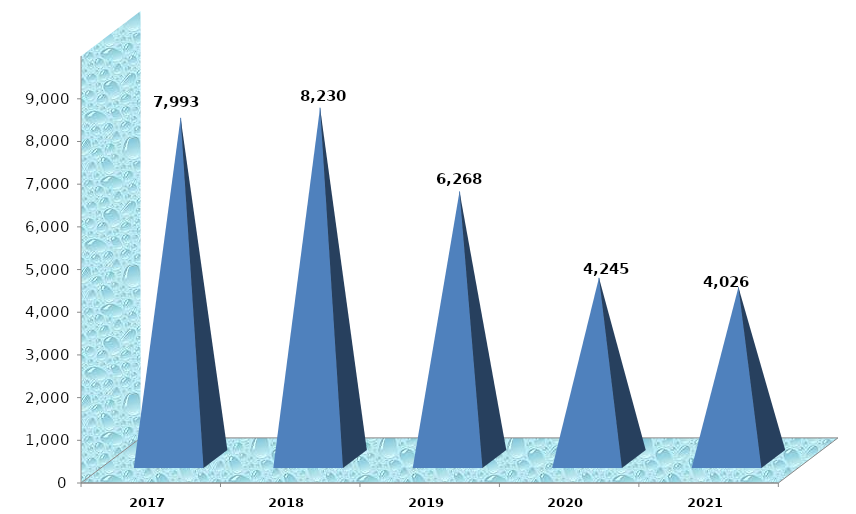
| Category | Series 0 |
|---|---|
| 2017 | 7992665.88 |
| 2018 | 8230144.67 |
| 2019 | 6268492.255 |
| 2020 | 4244591.102 |
| 2021 | 4025885 |